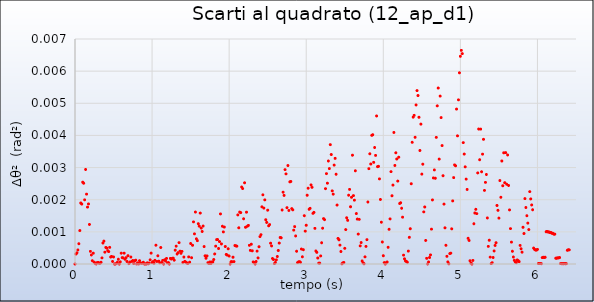
| Category | Series 0 |
|---|---|
| 0.0 | 0 |
| 0.012499999999999956 | 0 |
| 0.02499999999999991 | 0 |
| 0.03749999999999987 | 0 |
| 0.050000000000000044 | 0.001 |
| 0.0625 | 0.001 |
| 0.07499999999999996 | 0.002 |
| 0.08749999999999991 | 0.002 |
| 0.09999999999999987 | 0.003 |
| 0.11250000000000004 | 0.003 |
| 0.125 | 0.002 |
| 0.13749999999999996 | 0.003 |
| 0.1499999999999999 | 0.002 |
| 0.16249999999999987 | 0.002 |
| 0.17500000000000004 | 0.002 |
| 0.1875 | 0.001 |
| 0.19999999999999996 | 0 |
| 0.2124999999999999 | 0 |
| 0.22499999999999987 | 0 |
| 0.23750000000000004 | 0 |
| 0.25 | 0 |
| 0.26249999999999996 | 0 |
| 0.2749999999999999 | 0 |
| 0.28749999999999987 | 0 |
| 0.30000000000000004 | 0 |
| 0.3125 | 0 |
| 0.32499999999999996 | 0 |
| 0.3374999999999999 | 0 |
| 0.34999999999999987 | 0 |
| 0.36250000000000004 | 0.001 |
| 0.375 | 0.001 |
| 0.38749999999999996 | 0 |
| 0.40000000000000013 | 0.001 |
| 0.41249999999999987 | 0 |
| 0.42500000000000004 | 0 |
| 0.4374999999999998 | 0 |
| 0.44999999999999996 | 0.001 |
| 0.46250000000000013 | 0 |
| 0.47499999999999987 | 0 |
| 0.48750000000000004 | 0 |
| 0.4999999999999998 | 0 |
| 0.5125 | 0 |
| 0.5250000000000001 | 0 |
| 0.5374999999999999 | 0 |
| 0.55 | 0 |
| 0.5624999999999998 | 0 |
| 0.575 | 0 |
| 0.5875000000000001 | 0 |
| 0.5999999999999999 | 0 |
| 0.6125 | 0 |
| 0.6249999999999998 | 0 |
| 0.6375 | 0 |
| 0.6500000000000001 | 0 |
| 0.6624999999999999 | 0 |
| 0.675 | 0 |
| 0.6874999999999998 | 0 |
| 0.7 | 0 |
| 0.7125000000000001 | 0 |
| 0.7249999999999999 | 0 |
| 0.7375 | 0 |
| 0.7499999999999998 | 0 |
| 0.7625 | 0 |
| 0.7750000000000001 | 0 |
| 0.7874999999999999 | 0 |
| 0.8 | 0 |
| 0.8124999999999998 | 0 |
| 0.825 | 0 |
| 0.8375000000000001 | 0 |
| 0.8499999999999999 | 0 |
| 0.8625 | 0 |
| 0.8749999999999998 | 0 |
| 0.8875 | 0 |
| 0.9000000000000001 | 0 |
| 0.9124999999999999 | 0 |
| 0.925 | 0 |
| 0.9374999999999998 | 0 |
| 0.95 | 0 |
| 0.9625000000000001 | 0 |
| 0.9749999999999999 | 0 |
| 0.9875 | 0 |
| 0.9999999999999998 | 0 |
| 1.0125 | 0 |
| 1.0250000000000001 | 0 |
| 1.0374999999999999 | 0 |
| 1.05 | 0.001 |
| 1.0624999999999998 | 0 |
| 1.075 | 0 |
| 1.0875000000000001 | 0 |
| 1.0999999999999999 | 0 |
| 1.1125 | 0.001 |
| 1.1249999999999998 | 0 |
| 1.1375 | 0 |
| 1.1500000000000001 | 0 |
| 1.1624999999999999 | 0 |
| 1.175 | 0 |
| 1.1874999999999998 | 0 |
| 1.2 | 0 |
| 1.2125000000000001 | 0 |
| 1.2249999999999999 | 0 |
| 1.2375 | 0 |
| 1.2499999999999998 | 0 |
| 1.2625 | 0 |
| 1.2750000000000001 | 0 |
| 1.2874999999999999 | 0 |
| 1.3 | 0 |
| 1.3124999999999998 | 0.001 |
| 1.325 | 0 |
| 1.3375000000000001 | 0 |
| 1.3499999999999999 | 0.001 |
| 1.3625 | 0 |
| 1.3749999999999998 | 0 |
| 1.3875 | 0 |
| 1.4000000000000001 | 0 |
| 1.4124999999999999 | 0 |
| 1.425 | 0 |
| 1.4374999999999998 | 0 |
| 1.45 | 0 |
| 1.4625000000000001 | 0 |
| 1.4749999999999999 | 0 |
| 1.4875 | 0 |
| 1.4999999999999998 | 0.001 |
| 1.5125 | 0 |
| 1.5250000000000001 | 0.001 |
| 1.5374999999999999 | 0.001 |
| 1.55 | 0.001 |
| 1.5624999999999998 | 0.002 |
| 1.575 | 0.001 |
| 1.5875000000000001 | 0.001 |
| 1.5999999999999999 | 0.001 |
| 1.6125 | 0.001 |
| 1.6249999999999998 | 0.002 |
| 1.6375 | 0.001 |
| 1.6500000000000001 | 0.001 |
| 1.6624999999999999 | 0.001 |
| 1.675 | 0.001 |
| 1.6874999999999998 | 0 |
| 1.7 | 0 |
| 1.7125000000000001 | 0 |
| 1.7249999999999999 | 0 |
| 1.7375 | 0 |
| 1.7499999999999998 | 0 |
| 1.7625 | 0 |
| 1.7750000000000001 | 0 |
| 1.7874999999999999 | 0 |
| 1.8 | 0 |
| 1.8124999999999998 | 0 |
| 1.825 | 0.001 |
| 1.8375000000000001 | 0.001 |
| 1.8499999999999999 | 0.001 |
| 1.8625 | 0 |
| 1.8749999999999998 | 0.001 |
| 1.8875 | 0.002 |
| 1.9000000000000001 | 0.001 |
| 1.9124999999999999 | 0.001 |
| 1.925 | 0.001 |
| 1.9374999999999998 | 0.001 |
| 1.95 | 0.001 |
| 1.9625000000000001 | 0 |
| 1.9749999999999999 | 0 |
| 1.9875 | 0 |
| 1.9999999999999998 | 0 |
| 2.0125 | 0 |
| 2.0250000000000004 | 0 |
| 2.0374999999999996 | 0 |
| 2.05 | 0 |
| 2.0625 | 0 |
| 2.075 | 0.001 |
| 2.0875000000000004 | 0.001 |
| 2.0999999999999996 | 0.001 |
| 2.1125 | 0.002 |
| 2.125 | 0.001 |
| 2.1375 | 0.002 |
| 2.1500000000000004 | 0.002 |
| 2.1624999999999996 | 0.002 |
| 2.175 | 0.002 |
| 2.1875 | 0.001 |
| 2.2 | 0.003 |
| 2.2125000000000004 | 0.001 |
| 2.2249999999999996 | 0.002 |
| 2.2375 | 0.001 |
| 2.25 | 0.001 |
| 2.2625 | 0.001 |
| 2.2750000000000004 | 0 |
| 2.2874999999999996 | 0.001 |
| 2.3 | 0 |
| 2.3125 | 0 |
| 2.325 | 0 |
| 2.3375000000000004 | 0 |
| 2.3499999999999996 | 0 |
| 2.3625 | 0 |
| 2.375 | 0 |
| 2.3875 | 0.001 |
| 2.4000000000000004 | 0.001 |
| 2.4125000000000005 | 0.001 |
| 2.425 | 0.002 |
| 2.4375 | 0.002 |
| 2.45 | 0.002 |
| 2.4625000000000004 | 0.002 |
| 2.4750000000000005 | 0.001 |
| 2.4875 | 0.001 |
| 2.5 | 0.002 |
| 2.5125 | 0.001 |
| 2.5250000000000004 | 0.001 |
| 2.5375000000000005 | 0.001 |
| 2.55 | 0.001 |
| 2.5625 | 0 |
| 2.575 | 0 |
| 2.5875000000000004 | 0 |
| 2.6000000000000005 | 0 |
| 2.6125 | 0 |
| 2.625 | 0 |
| 2.6375 | 0 |
| 2.6500000000000004 | 0.001 |
| 2.6625000000000005 | 0.001 |
| 2.675 | 0.001 |
| 2.6875 | 0.002 |
| 2.7 | 0.002 |
| 2.7125000000000004 | 0.002 |
| 2.7250000000000005 | 0.003 |
| 2.7375 | 0.003 |
| 2.75 | 0.002 |
| 2.7625 | 0.003 |
| 2.7750000000000004 | 0.002 |
| 2.7875000000000005 | 0.003 |
| 2.8 | 0.003 |
| 2.8125 | 0.002 |
| 2.825 | 0.002 |
| 2.8375000000000004 | 0.001 |
| 2.8500000000000005 | 0.001 |
| 2.8625 | 0.001 |
| 2.875 | 0 |
| 2.8875 | 0 |
| 2.9000000000000004 | 0 |
| 2.9125000000000005 | 0 |
| 2.925 | 0 |
| 2.9375 | 0 |
| 2.95 | 0 |
| 2.9625000000000004 | 0 |
| 2.9750000000000005 | 0.002 |
| 2.9875 | 0.001 |
| 3.0 | 0.001 |
| 3.0125 | 0.002 |
| 3.0250000000000004 | 0.002 |
| 3.0375000000000005 | 0.002 |
| 3.05 | 0.002 |
| 3.0625 | 0.002 |
| 3.075 | 0.002 |
| 3.0875000000000004 | 0.002 |
| 3.1000000000000005 | 0.002 |
| 3.1125 | 0.001 |
| 3.125 | 0 |
| 3.1375 | 0 |
| 3.1500000000000004 | 0 |
| 3.1625000000000005 | 0 |
| 3.175 | 0 |
| 3.1875 | 0 |
| 3.2 | 0.001 |
| 3.2125000000000004 | 0.001 |
| 3.2250000000000005 | 0.001 |
| 3.2375 | 0.001 |
| 3.25 | 0.002 |
| 3.2625 | 0.003 |
| 3.2750000000000004 | 0.003 |
| 3.2875000000000005 | 0.003 |
| 3.3 | 0.003 |
| 3.3125 | 0.004 |
| 3.325 | 0.003 |
| 3.3375000000000004 | 0.002 |
| 3.3500000000000005 | 0.002 |
| 3.3625 | 0.003 |
| 3.375 | 0.003 |
| 3.3875 | 0.003 |
| 3.4000000000000004 | 0.002 |
| 3.4125000000000005 | 0.001 |
| 3.425 | 0.001 |
| 3.4375 | 0.001 |
| 3.45 | 0 |
| 3.4625000000000004 | 0 |
| 3.4750000000000005 | 0 |
| 3.4875 | 0 |
| 3.5 | 0 |
| 3.5125 | 0.001 |
| 3.5250000000000004 | 0.001 |
| 3.5375000000000005 | 0.001 |
| 3.55 | 0.002 |
| 3.5625 | 0.002 |
| 3.575 | 0.002 |
| 3.5875000000000004 | 0.002 |
| 3.6000000000000005 | 0.003 |
| 3.6125 | 0.002 |
| 3.625 | 0.002 |
| 3.6375 | 0.003 |
| 3.6500000000000004 | 0.002 |
| 3.6625000000000005 | 0.001 |
| 3.675 | 0.001 |
| 3.6875 | 0.001 |
| 3.7 | 0.001 |
| 3.7125000000000004 | 0.001 |
| 3.7250000000000005 | 0 |
| 3.7375 | 0 |
| 3.75 | 0 |
| 3.7625 | 0 |
| 3.7750000000000004 | 0.001 |
| 3.7875000000000005 | 0.001 |
| 3.8 | 0.002 |
| 3.8125 | 0.003 |
| 3.825 | 0.003 |
| 3.8375000000000004 | 0.003 |
| 3.8500000000000005 | 0.004 |
| 3.8625 | 0.004 |
| 3.875 | 0.003 |
| 3.8875 | 0.004 |
| 3.9000000000000004 | 0.003 |
| 3.9125000000000005 | 0.005 |
| 3.925 | 0.003 |
| 3.9375 | 0.003 |
| 3.95 | 0.003 |
| 3.9625000000000004 | 0.002 |
| 3.9750000000000005 | 0.001 |
| 3.9875 | 0.001 |
| 4.0 | 0 |
| 4.0125 | 0 |
| 4.025 | 0 |
| 4.0375000000000005 | 0 |
| 4.05 | 0 |
| 4.0625 | 0.001 |
| 4.075 | 0.001 |
| 4.0875 | 0.001 |
| 4.1000000000000005 | 0.003 |
| 4.1125 | 0.002 |
| 4.125 | 0.002 |
| 4.1375 | 0.004 |
| 4.15 | 0.003 |
| 4.1625000000000005 | 0.003 |
| 4.175 | 0.003 |
| 4.1875 | 0.003 |
| 4.2 | 0.003 |
| 4.2125 | 0.002 |
| 4.2250000000000005 | 0.002 |
| 4.2375 | 0.002 |
| 4.25 | 0.001 |
| 4.2625 | 0 |
| 4.275 | 0 |
| 4.2875000000000005 | 0 |
| 4.3 | 0 |
| 4.3125 | 0 |
| 4.325 | 0 |
| 4.3375 | 0.001 |
| 4.3500000000000005 | 0.001 |
| 4.3625 | 0.002 |
| 4.375 | 0.004 |
| 4.3875 | 0.005 |
| 4.4 | 0.005 |
| 4.4125000000000005 | 0.004 |
| 4.425 | 0.005 |
| 4.4375 | 0.005 |
| 4.45 | 0.005 |
| 4.4625 | 0.005 |
| 4.4750000000000005 | 0.004 |
| 4.4875 | 0.004 |
| 4.5 | 0.003 |
| 4.5125 | 0.003 |
| 4.525 | 0.002 |
| 4.5375000000000005 | 0.002 |
| 4.55 | 0.001 |
| 4.5625 | 0 |
| 4.575 | 0 |
| 4.5875 | 0 |
| 4.6000000000000005 | 0 |
| 4.6125 | 0 |
| 4.625 | 0.001 |
| 4.6375 | 0.002 |
| 4.65 | 0.003 |
| 4.6625000000000005 | 0.003 |
| 4.675 | 0.003 |
| 4.6875 | 0.004 |
| 4.7 | 0.005 |
| 4.7125 | 0.005 |
| 4.7250000000000005 | 0.003 |
| 4.7375 | 0.005 |
| 4.75 | 0.005 |
| 4.7625 | 0.004 |
| 4.775 | 0.003 |
| 4.7875000000000005 | 0.002 |
| 4.8 | 0.001 |
| 4.8125 | 0.001 |
| 4.825 | 0 |
| 4.8375 | 0 |
| 4.8500000000000005 | 0 |
| 4.8625 | 0 |
| 4.875 | 0 |
| 4.8875 | 0.001 |
| 4.9 | 0.002 |
| 4.9125000000000005 | 0.003 |
| 4.925 | 0.003 |
| 4.9375 | 0.003 |
| 4.95 | 0.005 |
| 4.9625 | 0.004 |
| 4.9750000000000005 | 0.005 |
| 4.9875 | 0.006 |
| 5.0 | 0.006 |
| 5.0125 | 0.007 |
| 5.025 | 0.007 |
| 5.0375000000000005 | 0.004 |
| 5.05 | 0.003 |
| 5.0625 | 0.003 |
| 5.075 | 0.003 |
| 5.0875 | 0.002 |
| 5.1000000000000005 | 0.001 |
| 5.1125 | 0.001 |
| 5.125 | 0 |
| 5.1375 | 0 |
| 5.15 | 0 |
| 5.1625000000000005 | 0 |
| 5.175 | 0.001 |
| 5.1875 | 0.002 |
| 5.2 | 0.002 |
| 5.2125 | 0.002 |
| 5.2250000000000005 | 0.003 |
| 5.2375 | 0.004 |
| 5.25 | 0.003 |
| 5.2625 | 0.004 |
| 5.275 | 0.003 |
| 5.2875000000000005 | 0.003 |
| 5.3 | 0.004 |
| 5.3125 | 0.002 |
| 5.325 | 0.003 |
| 5.3375 | 0.003 |
| 5.3500000000000005 | 0.001 |
| 5.3625 | 0.001 |
| 5.375 | 0.001 |
| 5.3875 | 0 |
| 5.4 | 0 |
| 5.4125000000000005 | 0 |
| 5.425 | 0 |
| 5.4375 | 0 |
| 5.45 | 0.001 |
| 5.4625 | 0.001 |
| 5.4750000000000005 | 0.002 |
| 5.4875 | 0.002 |
| 5.5 | 0.001 |
| 5.5125 | 0.003 |
| 5.525 | 0.002 |
| 5.5375000000000005 | 0.003 |
| 5.55 | 0.002 |
| 5.5625 | 0.003 |
| 5.575 | 0.003 |
| 5.5875 | 0.003 |
| 5.6000000000000005 | 0.002 |
| 5.6125 | 0.003 |
| 5.625 | 0.002 |
| 5.6375 | 0.002 |
| 5.65 | 0.001 |
| 5.6625000000000005 | 0.001 |
| 5.675 | 0 |
| 5.6875 | 0 |
| 5.7 | 0 |
| 5.7125 | 0 |
| 5.7250000000000005 | 0 |
| 5.7375 | 0 |
| 5.75 | 0 |
| 5.7625 | 0 |
| 5.775 | 0.001 |
| 5.7875000000000005 | 0 |
| 5.8 | 0 |
| 5.8125 | 0.001 |
| 5.825 | 0.001 |
| 5.8375 | 0.002 |
| 5.8500000000000005 | 0.002 |
| 5.8625 | 0.002 |
| 5.875 | 0.001 |
| 5.8875 | 0.001 |
| 5.9 | 0.002 |
| 5.9125000000000005 | 0.002 |
| 5.925 | 0.002 |
| 5.9375 | 0.002 |
| 5.95 | 0 |
| 5.9625 | 0 |
| 5.9750000000000005 | 0 |
| 5.9875 | 0 |
| 6.0 | 0 |
| 6.0125 | 0 |
| 6.025 | 0 |
| 6.0375000000000005 | 0 |
| 6.05 | 0 |
| 6.0625 | 0 |
| 6.075 | 0 |
| 6.0875 | 0 |
| 6.1000000000000005 | 0 |
| 6.1125 | 0.001 |
| 6.125 | 0.001 |
| 6.1375 | 0.001 |
| 6.15 | 0.001 |
| 6.1625000000000005 | 0.001 |
| 6.175 | 0.001 |
| 6.1875 | 0.001 |
| 6.2 | 0.001 |
| 6.2125 | 0.001 |
| 6.2250000000000005 | 0.001 |
| 6.2375 | 0 |
| 6.25 | 0 |
| 6.2625 | 0 |
| 6.275 | 0 |
| 6.2875000000000005 | 0 |
| 6.3 | 0 |
| 6.3125 | 0 |
| 6.325 | 0 |
| 6.3375 | 0 |
| 6.3500000000000005 | 0 |
| 6.3625 | 0 |
| 6.375 | 0 |
| 6.3875 | 0 |
| 6.3999999999999995 | 0 |
| 6.4125000000000005 | 0 |